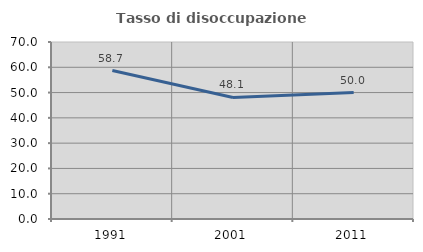
| Category | Tasso di disoccupazione giovanile  |
|---|---|
| 1991.0 | 58.696 |
| 2001.0 | 48.052 |
| 2011.0 | 50 |